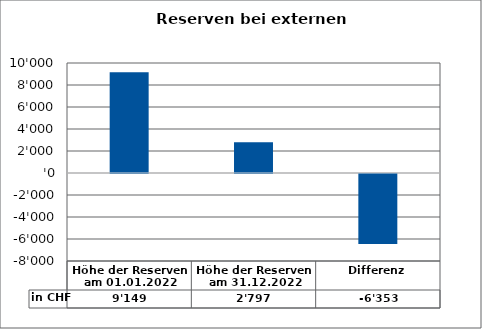
| Category | in CHF |
|---|---|
| Höhe der Reserven am 01.01.2022 | 9149.46 |
| Höhe der Reserven am 31.12.2022 | 2796.5 |
| Differenz | -6352.96 |